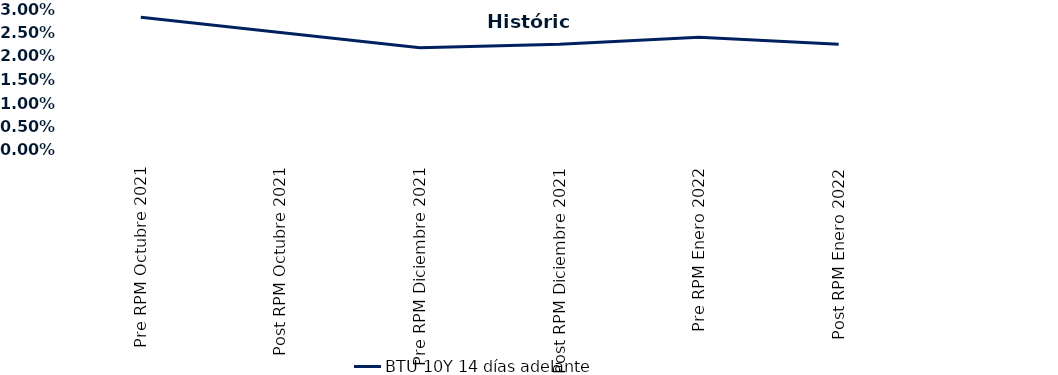
| Category | BTU 10Y 14 días adelante |
|---|---|
| Pre RPM Octubre 2021 | 0.028 |
| Post RPM Octubre 2021 | 0.025 |
| Pre RPM Diciembre 2021 | 0.022 |
| Post RPM Diciembre 2021 | 0.022 |
| Pre RPM Enero 2022 | 0.024 |
| Post RPM Enero 2022 | 0.022 |